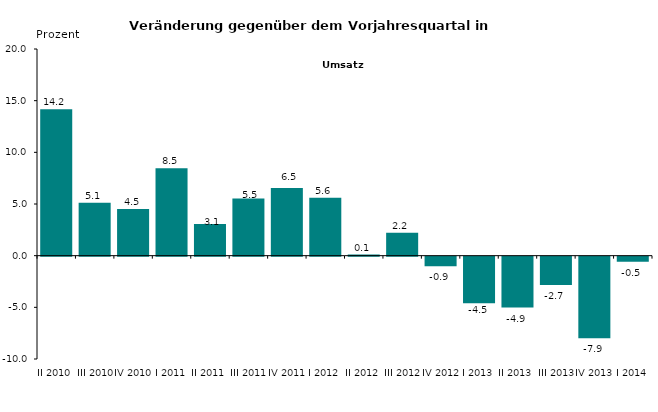
| Category | Series 0 |
|---|---|
| II 2010 | 14.167 |
| III 2010 | 5.127 |
| IV 2010 | 4.511 |
| I 2011 | 8.452 |
| II 2011 | 3.069 |
| III 2011 | 5.528 |
| IV 2011 | 6.549 |
| I 2012 | 5.603 |
| II 2012 | 0.11 |
| III 2012 | 2.228 |
| IV 2012 | -0.936 |
| I 2013 | -4.513 |
| II 2013 | -4.922 |
| III 2013 | -2.749 |
| IV 2013 | -7.9 |
| I 2014 | -0.5 |